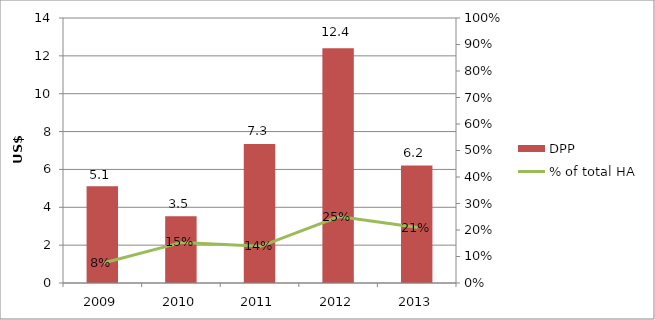
| Category | DPP |
|---|---|
| 2009.0 | 5.115 |
| 2010.0 | 3.521 |
| 2011.0 | 7.345 |
| 2012.0 | 12.408 |
| 2013.0 | 6.203 |